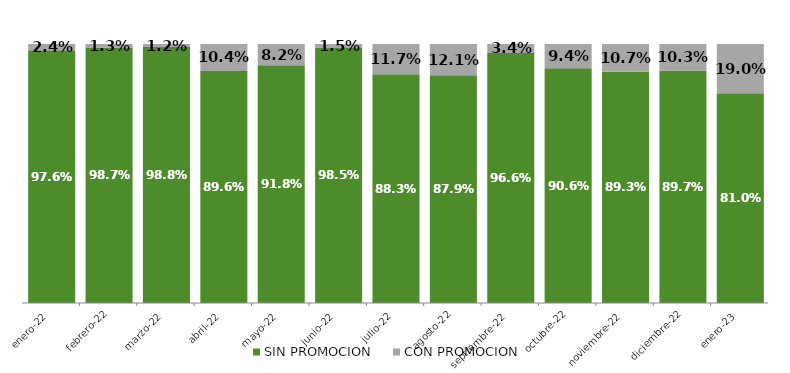
| Category | SIN PROMOCION   | CON PROMOCION   |
|---|---|---|
| 2022-01-01 | 0.976 | 0.024 |
| 2022-02-01 | 0.987 | 0.013 |
| 2022-03-01 | 0.988 | 0.012 |
| 2022-04-01 | 0.896 | 0.104 |
| 2022-05-01 | 0.918 | 0.082 |
| 2022-06-01 | 0.985 | 0.015 |
| 2022-07-01 | 0.883 | 0.117 |
| 2022-08-01 | 0.879 | 0.121 |
| 2022-09-01 | 0.966 | 0.034 |
| 2022-10-01 | 0.906 | 0.094 |
| 2022-11-01 | 0.893 | 0.107 |
| 2022-12-01 | 0.897 | 0.103 |
| 2023-01-01 | 0.81 | 0.19 |